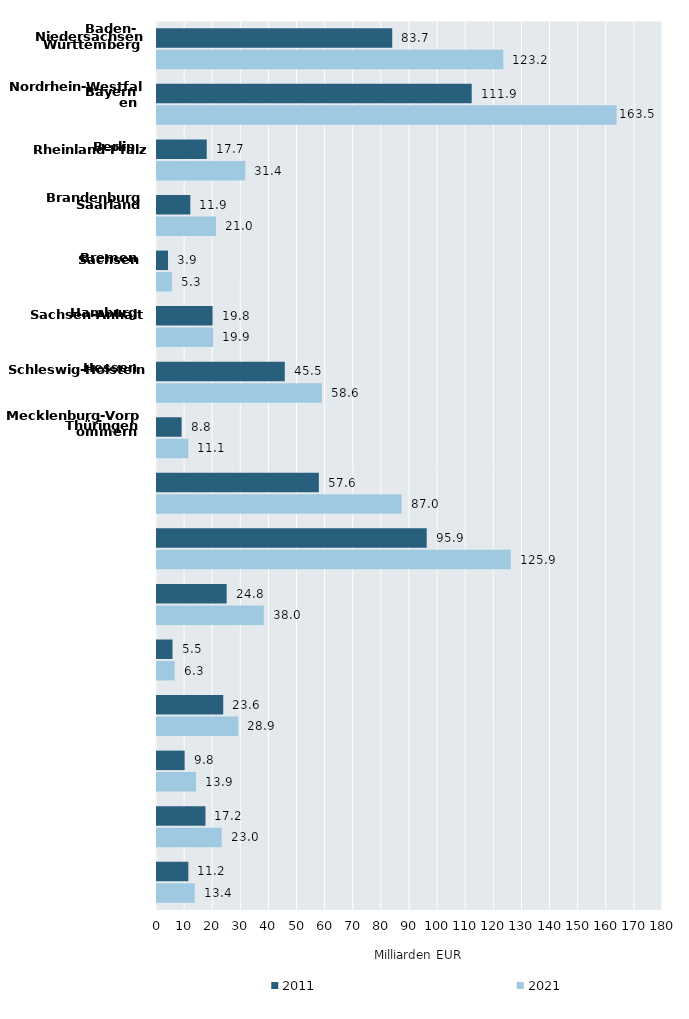
| Category | 2011 | 2021 |
|---|---|---|
| Baden-Württemberg | 83.68 | 123.188 |
| Bayern | 111.949 | 163.486 |
| Berlin | 17.688 | 31.404 |
| Brandenburg | 11.858 | 21.011 |
| Bremen | 3.925 | 5.338 |
| Hamburg | 19.779 | 19.946 |
| Hessen  | 45.454 | 58.646 |
| Mecklenburg-
Vorpommern | 8.752 | 11.126 |
| Niedersachsen | 57.573 | 86.994 |
| Nordrhein-Westfalen | 95.947 | 125.864 |
| Rheinland-Pfalz | 24.789 | 37.973 |
| Saarland | 5.515 | 6.273 |
| Sachsen | 23.561 | 28.916 |
| Sachsen-Anhalt | 9.837 | 13.881 |
| Schleswig-Holstein | 17.243 | 23.016 |
| Thüringen | 11.15 | 13.436 |